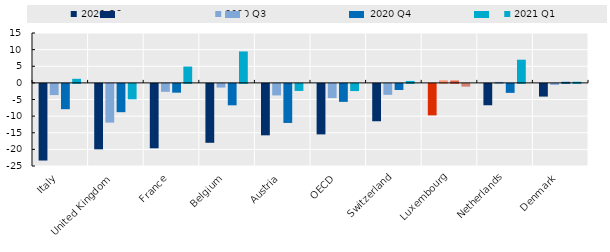
| Category | 2020 Q2 | 2020 Q3 | 2020 Q4 | 2021 Q1 |
|---|---|---|---|---|
| Italy | -23.054 | -3.364 | -7.61 | 1.224 |
| United Kingdom | -19.689 | -11.654 | -8.516 | -4.645 |
| France | -19.38 | -2.382 | -2.646 | 4.916 |
| Belgium | -17.722 | -1.114 | -6.451 | 9.455 |
| Austria | -15.473 | -3.47 | -11.754 | -2.118 |
| OECD | -15.192 | -4.264 | -5.413 | -2.164 |
| Switzerland | -11.242 | -3.297 | -1.845 | 0.583 |
| Luxembourg | -9.473 | 0.772 | 0.711 | -0.838 |
| Netherlands | -6.43 | 0.298 | -2.707 | 6.973 |
| Denmark | -3.825 | -0.298 | 0.329 | 0.341 |